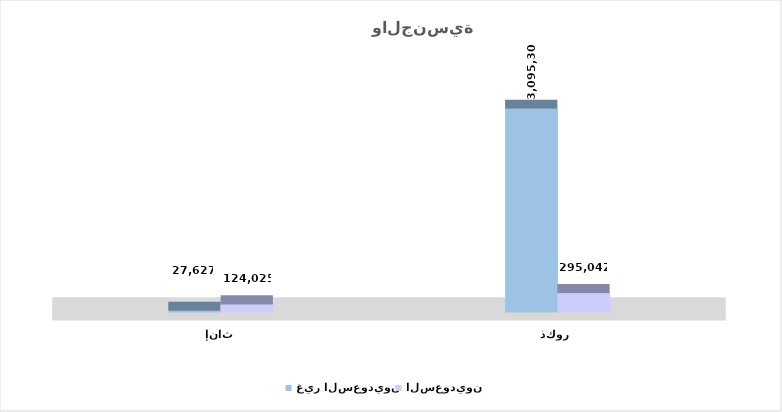
| Category | غير السعوديون
  | السعوديون
 |
|---|---|---|
| ذكور  | 3095303 | 295042 |
| إناث | 27627 | 124025 |